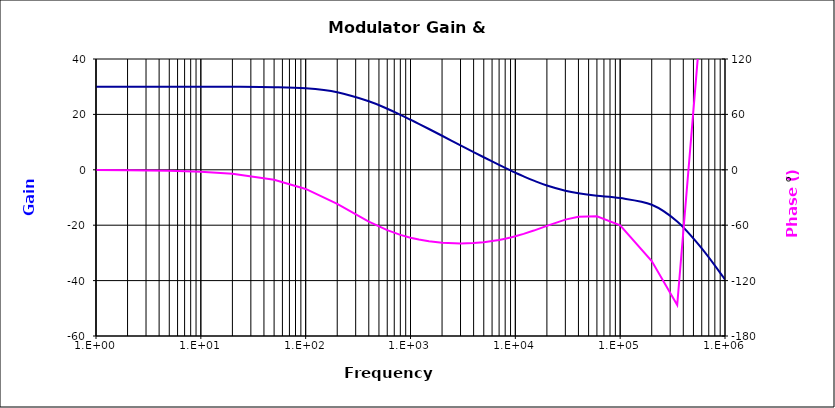
| Category | Series 0 |
|---|---|
| 1.0 | 29.993 |
| 2.0 | 29.993 |
| 5.0 | 29.991 |
| 10.0 | 29.987 |
| 20.0 | 29.968 |
| 50.0 | 29.838 |
| 100.0 | 29.403 |
| 200.0 | 28.001 |
| 400.0 | 24.771 |
| 600.0 | 22.044 |
| 800.0 | 19.862 |
| 1000.0 | 18.081 |
| 1200.0 | 16.586 |
| 1500.0 | 14.725 |
| 2000.0 | 12.294 |
| 3000.0 | 8.844 |
| 4000.0 | 6.404 |
| 5000.0 | 4.528 |
| 6000.0 | 3.015 |
| 7000.0 | 1.756 |
| 8000.0 | 0.685 |
| 9000.0 | -0.239 |
| 10000.0 | -1.047 |
| 12000.0 | -2.393 |
| 15000.0 | -3.926 |
| 20000.0 | -5.663 |
| 30000.0 | -7.552 |
| 40000.0 | -8.489 |
| 60000.0 | -9.37 |
| 100000.0 | -10.188 |
| 200000.0 | -12.613 |
| 350000.0 | -18.673 |
| 600000.0 | -28.362 |
| 1000000.0 | -39.558 |